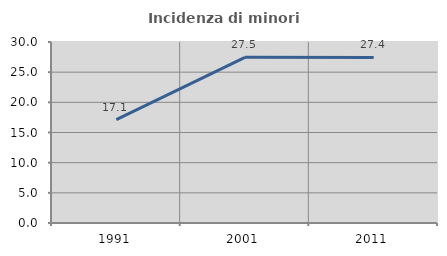
| Category | Incidenza di minori stranieri |
|---|---|
| 1991.0 | 17.136 |
| 2001.0 | 27.457 |
| 2011.0 | 27.44 |